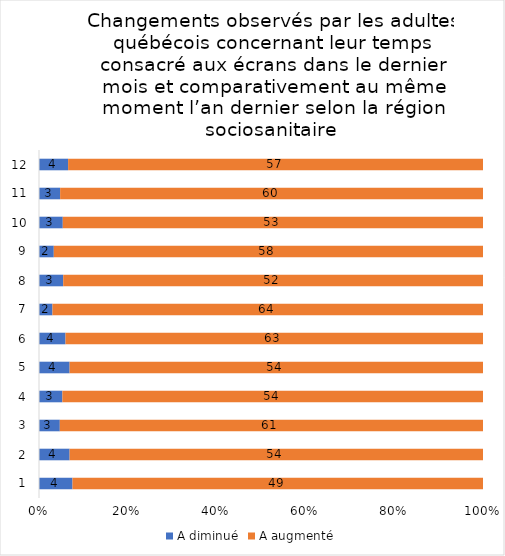
| Category | A diminué | A augmenté |
|---|---|---|
| 0 | 4 | 49 |
| 1 | 4 | 54 |
| 2 | 3 | 61 |
| 3 | 3 | 54 |
| 4 | 4 | 54 |
| 5 | 4 | 63 |
| 6 | 2 | 64 |
| 7 | 3 | 52 |
| 8 | 2 | 58 |
| 9 | 3 | 53 |
| 10 | 3 | 60 |
| 11 | 4 | 57 |